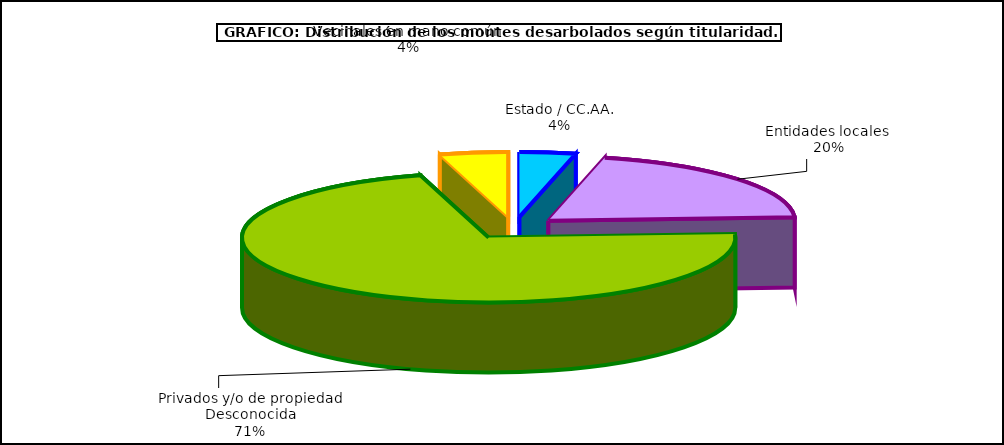
| Category | Series 0 |
|---|---|
| Estado / CC.AA. | 338365.365 |
| Entidades locales  | 1889921.479 |
| Privados y/o de propiedad Desconocida | 6589731.503 |
| Vecinales en mano común  | 412282.758 |